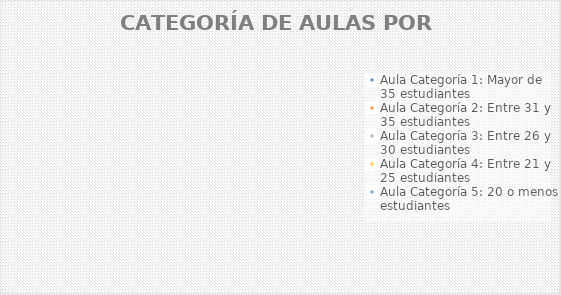
| Category | Series 0 | Series 1 |
|---|---|---|
| Aula Categoría 1: Mayor de 35 estudiantes | 0 |  |
| Aula Categoría 2: Entre 31 y 35 estudiantes | 0 |  |
| Aula Categoría 3: Entre 26 y 30 estudiantes | 0 |  |
| Aula Categoría 4: Entre 21 y 25 estudiantes | 0 |  |
| Aula Categoría 5: 20 o menos estudiantes | 0 |  |